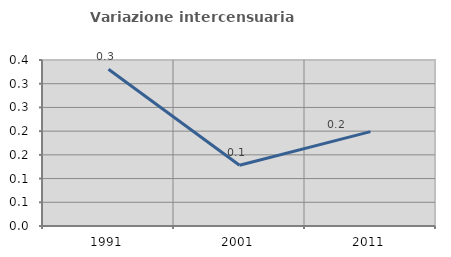
| Category | Variazione intercensuaria annua |
|---|---|
| 1991.0 | 0.331 |
| 2001.0 | 0.128 |
| 2011.0 | 0.199 |